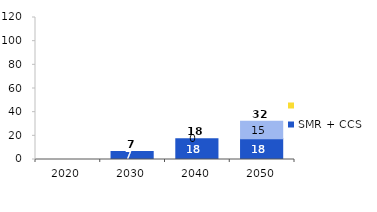
| Category | SMR + CCS | Electrolyser | Series 2 | Series 3 |
|---|---|---|---|---|
| 2020.0 | 0 | 0 |  | 0 |
| 2030.0 | 6.819 | 0 |  | 6.819 |
| 2040.0 | 17.589 | 0 |  | 17.589 |
| 2050.0 | 17.589 | 14.659 |  | 32.248 |